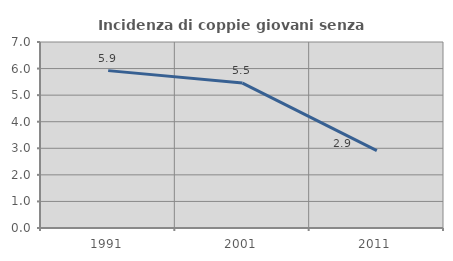
| Category | Incidenza di coppie giovani senza figli |
|---|---|
| 1991.0 | 5.923 |
| 2001.0 | 5.455 |
| 2011.0 | 2.909 |